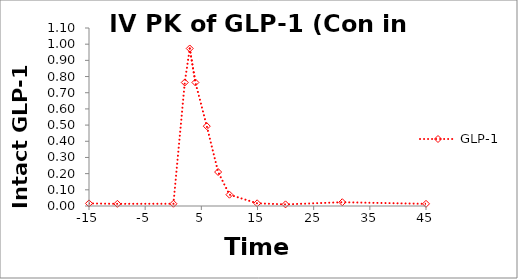
| Category | GLP-1  |
|---|---|
| -15.0 | 0.016 |
| -9.94737 | 0.013 |
| 0.0315789 | 0.014 |
| 2.05263 | 0.763 |
| 2.93684 | 0.973 |
| 3.94737 | 0.763 |
| 5.96842 | 0.493 |
| 7.98947 | 0.21 |
| 10.0105 | 0.07 |
| 14.9368 | 0.017 |
| 19.9895 | 0.01 |
| 30.0947 | 0.023 |
| 45.0 | 0.013 |